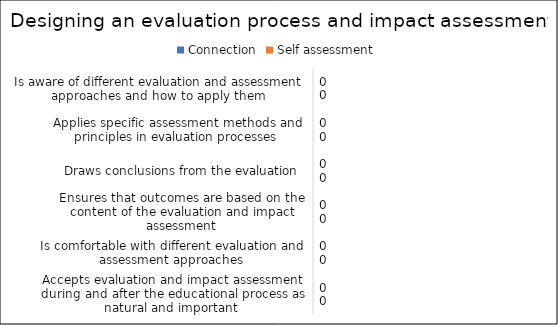
| Category | Connection | Self assessment |
|---|---|---|
| Is aware of different evaluation and assessment approaches and how to apply them  | 0 | 0 |
| Applies specific assessment methods and principles in evaluation processes  | 0 | 0 |
| Draws conclusions from the evaluation  | 0 | 0 |
| Ensures that outcomes are based on the content of the evaluation and impact assessment | 0 | 0 |
| Is comfortable with different evaluation and assessment approaches | 0 | 0 |
| Accepts evaluation and impact assessment during and after the educational process as natural and important  | 0 | 0 |